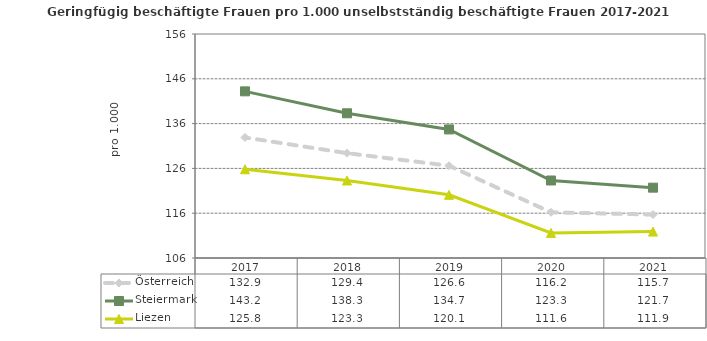
| Category | Österreich | Steiermark | Liezen |
|---|---|---|---|
| 2021.0 | 115.7 | 121.7 | 111.9 |
| 2020.0 | 116.2 | 123.3 | 111.6 |
| 2019.0 | 126.6 | 134.7 | 120.1 |
| 2018.0 | 129.4 | 138.3 | 123.3 |
| 2017.0 | 132.9 | 143.2 | 125.8 |